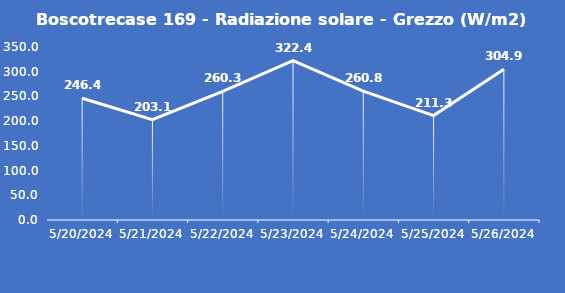
| Category | Boscotrecase 169 - Radiazione solare - Grezzo (W/m2) |
|---|---|
| 5/20/24 | 246.4 |
| 5/21/24 | 203.1 |
| 5/22/24 | 260.3 |
| 5/23/24 | 322.4 |
| 5/24/24 | 260.8 |
| 5/25/24 | 211.3 |
| 5/26/24 | 304.9 |